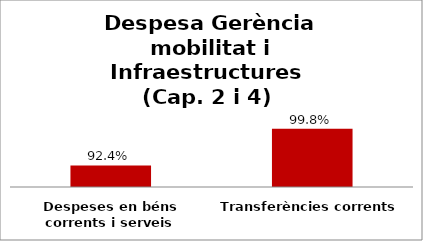
| Category | Series 0 |
|---|---|
| Despeses en béns corrents i serveis | 0.924 |
| Transferències corrents | 0.998 |